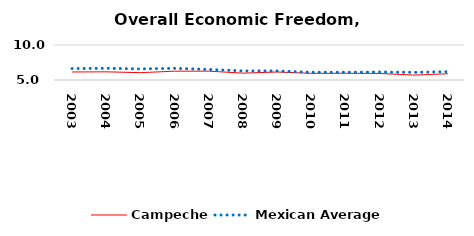
| Category | Campeche | Mexican Average  |
|---|---|---|
| 2003.0 | 6.146 | 6.632 |
| 2004.0 | 6.167 | 6.678 |
| 2005.0 | 6.05 | 6.582 |
| 2006.0 | 6.257 | 6.668 |
| 2007.0 | 6.265 | 6.508 |
| 2008.0 | 5.98 | 6.3 |
| 2009.0 | 6.144 | 6.3 |
| 2010.0 | 5.951 | 6.105 |
| 2011.0 | 5.963 | 6.103 |
| 2012.0 | 5.938 | 6.144 |
| 2013.0 | 5.698 | 6.087 |
| 2014.0 | 5.895 | 6.195 |